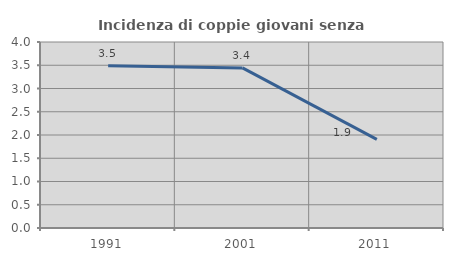
| Category | Incidenza di coppie giovani senza figli |
|---|---|
| 1991.0 | 3.491 |
| 2001.0 | 3.442 |
| 2011.0 | 1.907 |